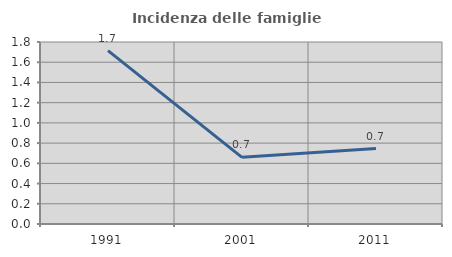
| Category | Incidenza delle famiglie numerose |
|---|---|
| 1991.0 | 1.714 |
| 2001.0 | 0.659 |
| 2011.0 | 0.746 |